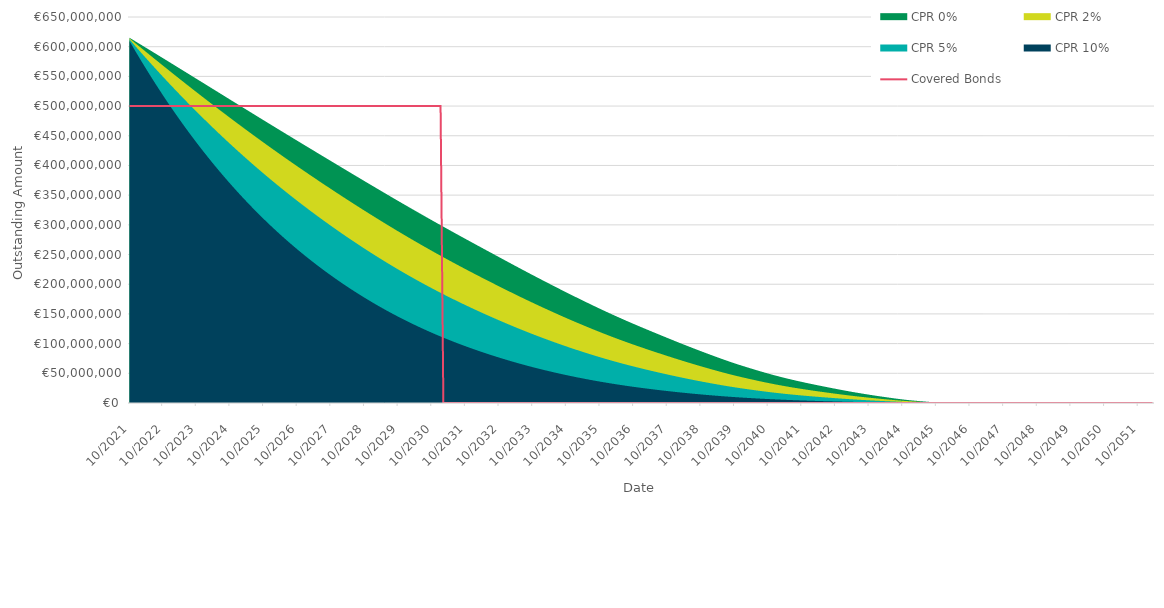
| Category | Covered Bonds |
|---|---|
| 2021-10-31 | 500000000 |
| 2021-11-30 | 500000000 |
| 2021-12-31 | 500000000 |
| 2022-01-31 | 500000000 |
| 2022-02-28 | 500000000 |
| 2022-03-31 | 500000000 |
| 2022-04-30 | 500000000 |
| 2022-05-31 | 500000000 |
| 2022-06-30 | 500000000 |
| 2022-07-31 | 500000000 |
| 2022-08-31 | 500000000 |
| 2022-09-30 | 500000000 |
| 2022-10-31 | 500000000 |
| 2022-11-30 | 500000000 |
| 2022-12-31 | 500000000 |
| 2023-01-31 | 500000000 |
| 2023-02-28 | 500000000 |
| 2023-03-31 | 500000000 |
| 2023-04-30 | 500000000 |
| 2023-05-31 | 500000000 |
| 2023-06-30 | 500000000 |
| 2023-07-31 | 500000000 |
| 2023-08-31 | 500000000 |
| 2023-09-30 | 500000000 |
| 2023-10-31 | 500000000 |
| 2023-11-30 | 500000000 |
| 2023-12-31 | 500000000 |
| 2024-01-31 | 500000000 |
| 2024-02-29 | 500000000 |
| 2024-03-31 | 500000000 |
| 2024-04-30 | 500000000 |
| 2024-05-31 | 500000000 |
| 2024-06-30 | 500000000 |
| 2024-07-31 | 500000000 |
| 2024-08-31 | 500000000 |
| 2024-09-30 | 500000000 |
| 2024-10-31 | 500000000 |
| 2024-11-30 | 500000000 |
| 2024-12-31 | 500000000 |
| 2025-01-31 | 500000000 |
| 2025-02-28 | 500000000 |
| 2025-03-31 | 500000000 |
| 2025-04-30 | 500000000 |
| 2025-05-31 | 500000000 |
| 2025-06-30 | 500000000 |
| 2025-07-31 | 500000000 |
| 2025-08-31 | 500000000 |
| 2025-09-30 | 500000000 |
| 2025-10-31 | 500000000 |
| 2025-11-30 | 500000000 |
| 2025-12-31 | 500000000 |
| 2026-01-31 | 500000000 |
| 2026-02-28 | 500000000 |
| 2026-03-31 | 500000000 |
| 2026-04-30 | 500000000 |
| 2026-05-31 | 500000000 |
| 2026-06-30 | 500000000 |
| 2026-07-31 | 500000000 |
| 2026-08-31 | 500000000 |
| 2026-09-30 | 500000000 |
| 2026-10-31 | 500000000 |
| 2026-11-30 | 500000000 |
| 2026-12-31 | 500000000 |
| 2027-01-31 | 500000000 |
| 2027-02-28 | 500000000 |
| 2027-03-31 | 500000000 |
| 2027-04-30 | 500000000 |
| 2027-05-31 | 500000000 |
| 2027-06-30 | 500000000 |
| 2027-07-31 | 500000000 |
| 2027-08-31 | 500000000 |
| 2027-09-30 | 500000000 |
| 2027-10-31 | 500000000 |
| 2027-11-30 | 500000000 |
| 2027-12-31 | 500000000 |
| 2028-01-31 | 500000000 |
| 2028-02-29 | 500000000 |
| 2028-03-31 | 500000000 |
| 2028-04-30 | 500000000 |
| 2028-05-31 | 500000000 |
| 2028-06-30 | 500000000 |
| 2028-07-31 | 500000000 |
| 2028-08-31 | 500000000 |
| 2028-09-30 | 500000000 |
| 2028-10-31 | 500000000 |
| 2028-11-30 | 500000000 |
| 2028-12-31 | 500000000 |
| 2029-01-31 | 500000000 |
| 2029-02-28 | 500000000 |
| 2029-03-31 | 500000000 |
| 2029-04-30 | 500000000 |
| 2029-05-31 | 500000000 |
| 2029-06-30 | 500000000 |
| 2029-07-31 | 500000000 |
| 2029-08-31 | 500000000 |
| 2029-09-30 | 500000000 |
| 2029-10-31 | 500000000 |
| 2029-11-30 | 500000000 |
| 2029-12-31 | 500000000 |
| 2030-01-31 | 500000000 |
| 2030-02-28 | 500000000 |
| 2030-03-31 | 500000000 |
| 2030-04-30 | 500000000 |
| 2030-05-31 | 500000000 |
| 2030-06-30 | 500000000 |
| 2030-07-31 | 500000000 |
| 2030-08-31 | 500000000 |
| 2030-09-30 | 500000000 |
| 2030-10-31 | 500000000 |
| 2030-11-30 | 500000000 |
| 2030-12-31 | 500000000 |
| 2031-01-31 | 500000000 |
| 2031-02-28 | 0 |
| 2031-03-31 | 0 |
| 2031-04-30 | 0 |
| 2031-05-31 | 0 |
| 2031-06-30 | 0 |
| 2031-07-31 | 0 |
| 2031-08-31 | 0 |
| 2031-09-30 | 0 |
| 2031-10-31 | 0 |
| 2031-11-30 | 0 |
| 2031-12-31 | 0 |
| 2032-01-31 | 0 |
| 2032-02-29 | 0 |
| 2032-03-31 | 0 |
| 2032-04-30 | 0 |
| 2032-05-31 | 0 |
| 2032-06-30 | 0 |
| 2032-07-31 | 0 |
| 2032-08-31 | 0 |
| 2032-09-30 | 0 |
| 2032-10-31 | 0 |
| 2032-11-30 | 0 |
| 2032-12-31 | 0 |
| 2033-01-31 | 0 |
| 2033-02-28 | 0 |
| 2033-03-31 | 0 |
| 2033-04-30 | 0 |
| 2033-05-31 | 0 |
| 2033-06-30 | 0 |
| 2033-07-31 | 0 |
| 2033-08-31 | 0 |
| 2033-09-30 | 0 |
| 2033-10-31 | 0 |
| 2033-11-30 | 0 |
| 2033-12-31 | 0 |
| 2034-01-31 | 0 |
| 2034-02-28 | 0 |
| 2034-03-31 | 0 |
| 2034-04-30 | 0 |
| 2034-05-31 | 0 |
| 2034-06-30 | 0 |
| 2034-07-31 | 0 |
| 2034-08-31 | 0 |
| 2034-09-30 | 0 |
| 2034-10-31 | 0 |
| 2034-11-30 | 0 |
| 2034-12-31 | 0 |
| 2035-01-31 | 0 |
| 2035-02-28 | 0 |
| 2035-03-31 | 0 |
| 2035-04-30 | 0 |
| 2035-05-31 | 0 |
| 2035-06-30 | 0 |
| 2035-07-31 | 0 |
| 2035-08-31 | 0 |
| 2035-09-30 | 0 |
| 2035-10-31 | 0 |
| 2035-11-30 | 0 |
| 2035-12-31 | 0 |
| 2036-01-31 | 0 |
| 2036-02-29 | 0 |
| 2036-03-31 | 0 |
| 2036-04-30 | 0 |
| 2036-05-31 | 0 |
| 2036-06-30 | 0 |
| 2036-07-31 | 0 |
| 2036-08-31 | 0 |
| 2036-09-30 | 0 |
| 2036-10-31 | 0 |
| 2036-11-30 | 0 |
| 2036-12-31 | 0 |
| 2037-01-31 | 0 |
| 2037-02-28 | 0 |
| 2037-03-31 | 0 |
| 2037-04-30 | 0 |
| 2037-05-31 | 0 |
| 2037-06-30 | 0 |
| 2037-07-31 | 0 |
| 2037-08-31 | 0 |
| 2037-09-30 | 0 |
| 2037-10-31 | 0 |
| 2037-11-30 | 0 |
| 2037-12-31 | 0 |
| 2038-01-31 | 0 |
| 2038-02-28 | 0 |
| 2038-03-31 | 0 |
| 2038-04-30 | 0 |
| 2038-05-31 | 0 |
| 2038-06-30 | 0 |
| 2038-07-31 | 0 |
| 2038-08-31 | 0 |
| 2038-09-30 | 0 |
| 2038-10-31 | 0 |
| 2038-11-30 | 0 |
| 2038-12-31 | 0 |
| 2039-01-31 | 0 |
| 2039-02-28 | 0 |
| 2039-03-31 | 0 |
| 2039-04-30 | 0 |
| 2039-05-31 | 0 |
| 2039-06-30 | 0 |
| 2039-07-31 | 0 |
| 2039-08-31 | 0 |
| 2039-09-30 | 0 |
| 2039-10-31 | 0 |
| 2039-11-30 | 0 |
| 2039-12-31 | 0 |
| 2040-01-31 | 0 |
| 2040-02-29 | 0 |
| 2040-03-31 | 0 |
| 2040-04-30 | 0 |
| 2040-05-31 | 0 |
| 2040-06-30 | 0 |
| 2040-07-31 | 0 |
| 2040-08-31 | 0 |
| 2040-09-30 | 0 |
| 2040-10-31 | 0 |
| 2040-11-30 | 0 |
| 2040-12-31 | 0 |
| 2041-01-31 | 0 |
| 2041-02-28 | 0 |
| 2041-03-31 | 0 |
| 2041-04-30 | 0 |
| 2041-05-31 | 0 |
| 2041-06-30 | 0 |
| 2041-07-31 | 0 |
| 2041-08-31 | 0 |
| 2041-09-30 | 0 |
| 2041-10-31 | 0 |
| 2041-11-30 | 0 |
| 2041-12-31 | 0 |
| 2042-01-31 | 0 |
| 2042-02-28 | 0 |
| 2042-03-31 | 0 |
| 2042-04-30 | 0 |
| 2042-05-31 | 0 |
| 2042-06-30 | 0 |
| 2042-07-31 | 0 |
| 2042-08-31 | 0 |
| 2042-09-30 | 0 |
| 2042-10-31 | 0 |
| 2042-11-30 | 0 |
| 2042-12-31 | 0 |
| 2043-01-31 | 0 |
| 2043-02-28 | 0 |
| 2043-03-31 | 0 |
| 2043-04-30 | 0 |
| 2043-05-31 | 0 |
| 2043-06-30 | 0 |
| 2043-07-31 | 0 |
| 2043-08-31 | 0 |
| 2043-09-30 | 0 |
| 2043-10-31 | 0 |
| 2043-11-30 | 0 |
| 2043-12-31 | 0 |
| 2044-01-31 | 0 |
| 2044-02-29 | 0 |
| 2044-03-31 | 0 |
| 2044-04-30 | 0 |
| 2044-05-31 | 0 |
| 2044-06-30 | 0 |
| 2044-07-31 | 0 |
| 2044-08-31 | 0 |
| 2044-09-30 | 0 |
| 2044-10-31 | 0 |
| 2044-11-30 | 0 |
| 2044-12-31 | 0 |
| 2045-01-31 | 0 |
| 2045-02-28 | 0 |
| 2045-03-31 | 0 |
| 2045-04-30 | 0 |
| 2045-05-31 | 0 |
| 2045-06-30 | 0 |
| 2045-07-31 | 0 |
| 2045-08-31 | 0 |
| 2045-09-30 | 0 |
| 2045-10-31 | 0 |
| 2045-11-30 | 0 |
| 2045-12-31 | 0 |
| 2046-01-31 | 0 |
| 2046-02-28 | 0 |
| 2046-03-31 | 0 |
| 2046-04-30 | 0 |
| 2046-05-31 | 0 |
| 2046-06-30 | 0 |
| 2046-07-31 | 0 |
| 2046-08-31 | 0 |
| 2046-09-30 | 0 |
| 2046-10-31 | 0 |
| 2046-11-30 | 0 |
| 2046-12-31 | 0 |
| 2047-01-31 | 0 |
| 2047-02-28 | 0 |
| 2047-03-31 | 0 |
| 2047-04-30 | 0 |
| 2047-05-31 | 0 |
| 2047-06-30 | 0 |
| 2047-07-31 | 0 |
| 2047-08-31 | 0 |
| 2047-09-30 | 0 |
| 2047-10-31 | 0 |
| 2047-11-30 | 0 |
| 2047-12-31 | 0 |
| 2048-01-31 | 0 |
| 2048-02-29 | 0 |
| 2048-03-31 | 0 |
| 2048-04-30 | 0 |
| 2048-05-31 | 0 |
| 2048-06-30 | 0 |
| 2048-07-31 | 0 |
| 2048-08-31 | 0 |
| 2048-09-30 | 0 |
| 2048-10-31 | 0 |
| 2048-11-30 | 0 |
| 2048-12-31 | 0 |
| 2049-01-31 | 0 |
| 2049-02-28 | 0 |
| 2049-03-31 | 0 |
| 2049-04-30 | 0 |
| 2049-05-31 | 0 |
| 2049-06-30 | 0 |
| 2049-07-31 | 0 |
| 2049-08-31 | 0 |
| 2049-09-30 | 0 |
| 2049-10-31 | 0 |
| 2049-11-30 | 0 |
| 2049-12-31 | 0 |
| 2050-01-31 | 0 |
| 2050-02-28 | 0 |
| 2050-03-31 | 0 |
| 2050-04-30 | 0 |
| 2050-05-31 | 0 |
| 2050-06-30 | 0 |
| 2050-07-31 | 0 |
| 2050-08-31 | 0 |
| 2050-09-30 | 0 |
| 2050-10-31 | 0 |
| 2050-11-30 | 0 |
| 2050-12-31 | 0 |
| 2051-01-31 | 0 |
| 2051-02-28 | 0 |
| 2051-03-31 | 0 |
| 2051-04-30 | 0 |
| 2051-05-31 | 0 |
| 2051-06-30 | 0 |
| 2051-07-31 | 0 |
| 2051-08-31 | 0 |
| 2051-09-30 | 0 |
| 2051-10-31 | 0 |
| 2051-11-30 | 0 |
| 2051-12-31 | 0 |
| 2052-01-31 | 0 |
| 2052-02-29 | 0 |
| 2052-03-31 | 0 |